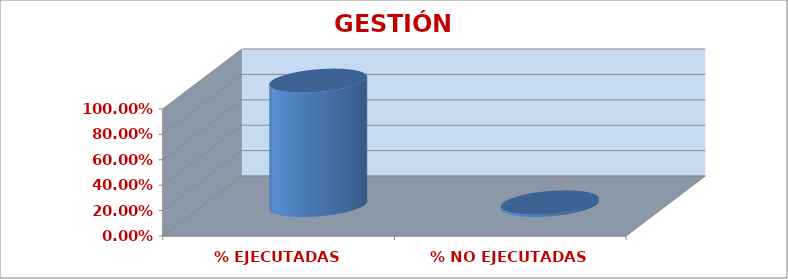
| Category | GESTIÓN ACADÉMICA |
|---|---|
| % EJECUTADAS | 0.979 |
| % NO EJECUTADAS | 0.021 |